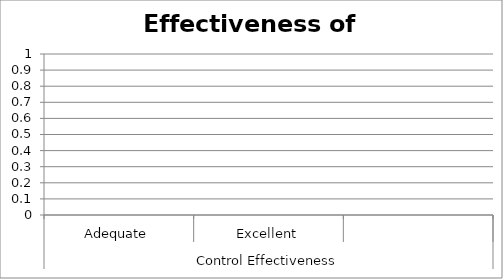
| Category | Effectiveness of Controls |
|---|---|
| 0 | 0 |
| 1 | 0 |
| 2 | 0 |